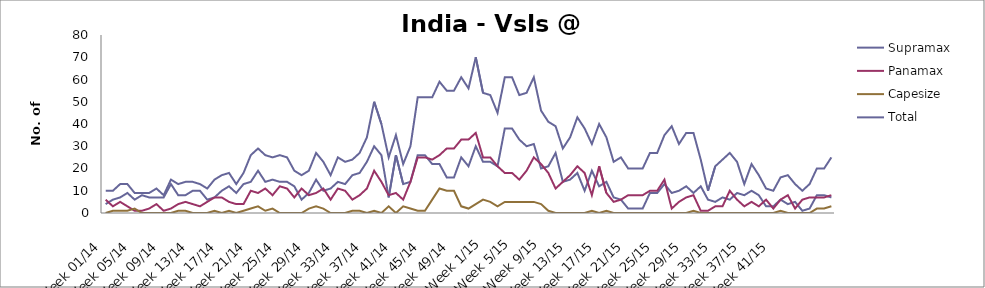
| Category | Supramax | Panamax | Capesize | Total |
|---|---|---|---|---|
| Week 01/14 | 4 | 6 | 0 | 10 |
| Week 02/14 | 6 | 3 | 1 | 10 |
| Week 03/14 | 7 | 5 | 1 | 13 |
| Week 04/14 | 9 | 3 | 1 | 13 |
| Week 05/14 | 6 | 1 | 2 | 9 |
| Week 06/14 | 8 | 1 | 0 | 9 |
| Week 07/14 | 7 | 2 | 0 | 9 |
| Week 08/14 | 7 | 4 | 0 | 11 |
| Week 09/14 | 7 | 1 | 0 | 8 |
| Week 10/14 | 13 | 2 | 0 | 15 |
| Week 11/14 | 8 | 4 | 1 | 13 |
| Week 12/14 | 8 | 5 | 1 | 14 |
| Week 13/14 | 10 | 4 | 0 | 14 |
| Week 14/14 | 10 | 3 | 0 | 13 |
| Week 15/14 | 6 | 5 | 0 | 11 |
| Week 16/14 | 7 | 7 | 1 | 15 |
| Week 17/14 | 10 | 7 | 0 | 17 |
| Week 18/14 | 12 | 5 | 1 | 18 |
| Week 19/14 | 9 | 4 | 0 | 13 |
| Week 20/14 | 13 | 4 | 1 | 18 |
| Week 21/14 | 14 | 10 | 2 | 26 |
| Week 22/14 | 19 | 9 | 3 | 29 |
| Week 23/14 | 14 | 11 | 1 | 26 |
| Week 24/14 | 15 | 8 | 2 | 25 |
| Week 25/14 | 14 | 12 | 0 | 26 |
| Week 26/14 | 14 | 11 | 0 | 25 |
| Week 27/14 | 12 | 7 | 0 | 19 |
| Week 28/14 | 6 | 11 | 0 | 17 |
| Week 29/14 | 9 | 8 | 2 | 19 |
| Week 30/14 | 15 | 9 | 3 | 27 |
| Week 31/14 | 10 | 11 | 2 | 23 |
| Week 32/14 | 11 | 6 | 0 | 17 |
| Week 33/14 | 14 | 11 | 0 | 25 |
| Week 34/14 | 13 | 10 | 0 | 23 |
| Week 35/14 | 17 | 6 | 1 | 24 |
| Week 36/14 | 18 | 8 | 1 | 27 |
| Week 37/14 | 23 | 11 | 0 | 34 |
| Week 38/14 | 30 | 19 | 1 | 50 |
| Week 39/14 | 26 | 14 | 0 | 40 |
| Week 40/14 | 7 | 8 | 3 | 25 |
| Week 41/14 | 26 | 9 | 0 | 35 |
| Week 42/14 | 13 | 6 | 3 | 22 |
| Week 43/14 | 14 | 14 | 2 | 30 |
| Week 44/14 | 26 | 25 | 1 | 52 |
| Week 45/14 | 26 | 25 | 1 | 52 |
| Week 46/14 | 22 | 24 | 6 | 52 |
| Week 47/14 | 22 | 26 | 11 | 59 |
| Week 48/14 | 16 | 29 | 10 | 55 |
| Week 49/14 | 16 | 29 | 10 | 55 |
| Week 50/14 | 25 | 33 | 3 | 61 |
| Week 51/14 | 21 | 33 | 2 | 56 |
| Week 52/14 | 30 | 36 | 4 | 70 |
| Week 1/15 | 23 | 25 | 6 | 54 |
| Week 2/15 | 23 | 25 | 5 | 53 |
| Week 3/15 | 21 | 21 | 3 | 45 |
| Week 4/15 | 38 | 18 | 5 | 61 |
| Week 5/15 | 38 | 18 | 5 | 61 |
| Week 6/15 | 33 | 15 | 5 | 53 |
| Week 7/15 | 30 | 19 | 5 | 54 |
| Week 8/15 | 31 | 25 | 5 | 61 |
| Week 9/15 | 20 | 22 | 4 | 46 |
| Week 10/15 | 21 | 18 | 1 | 41 |
| Week 11/15 | 27 | 11 | 0 | 39 |
| Week 12/15 | 14 | 14 | 0 | 29 |
| Week 13/15 | 15 | 17 | 0 | 34 |
| Week 14/15 | 18 | 21 | 0 | 43 |
| Week 15/15 | 10 | 18 | 0 | 38 |
| Week 16/15 | 19 | 8 | 1 | 31 |
| Week 17/15 | 12 | 21 | 0 | 40 |
| Week 18/15 | 14 | 9 | 1 | 34 |
| Week 19/15 | 7 | 5 | 0 | 23 |
| Week 20/15 | 6 | 6 | 0 | 25 |
| Week 21/15 | 2 | 8 | 0 | 20 |
| Week 22/15 | 2 | 8 | 0 | 20 |
| Week 23/15 | 2 | 8 | 0 | 20 |
| Week 24/15 | 9 | 10 | 0 | 27 |
| Week 25/15 | 9 | 10 | 0 | 27 |
| Week 26/15 | 13 | 15 | 0 | 35 |
| Week 27/15 | 9 | 2 | 0 | 39 |
| Week 28/15 | 10 | 5 | 0 | 31 |
| Week 29/15 | 12 | 7 | 0 | 36 |
| Week 30/15 | 9 | 8 | 1 | 36 |
| Week 31/15 | 12 | 1 | 0 | 24 |
| Week 32/15 | 6 | 1 | 0 | 10 |
| Week 33/15 | 5 | 3 | 0 | 21 |
| Week 34/15 | 7 | 3 | 0 | 24 |
| Week 35/15 | 6 | 10 | 0 | 27 |
| Week 36/15 | 9 | 6 | 0 | 23 |
| Week 37/15 | 8 | 3 | 0 | 13 |
| Week 38/15 | 10 | 5 | 0 | 22 |
| Week 39/15 | 8 | 3 | 0 | 17 |
| Week 40/15 | 3 | 6 | 0 | 11 |
| Week 41/15 | 3 | 2 | 0 | 10 |
| Week 42/15 | 6 | 6 | 1 | 16 |